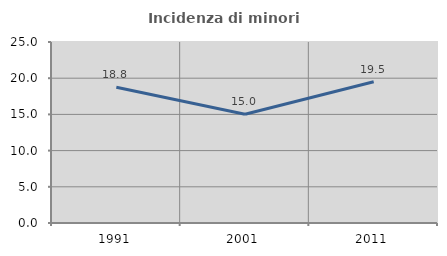
| Category | Incidenza di minori stranieri |
|---|---|
| 1991.0 | 18.75 |
| 2001.0 | 15.023 |
| 2011.0 | 19.512 |